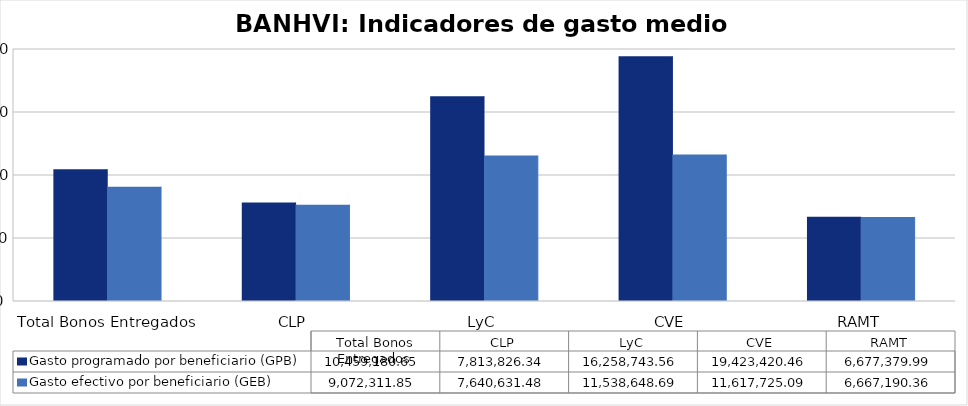
| Category | Gasto programado por beneficiario (GPB)  | Gasto efectivo por beneficiario (GEB)  |
|---|---|---|
| Total Bonos Entregados | 10459180.647 | 9072311.849 |
| CLP | 7813826.345 | 7640631.483 |
| LyC | 16258743.558 | 11538648.692 |
| CVE | 19423420.46 | 11617725.092 |
| RAMT | 6677379.994 | 6667190.36 |